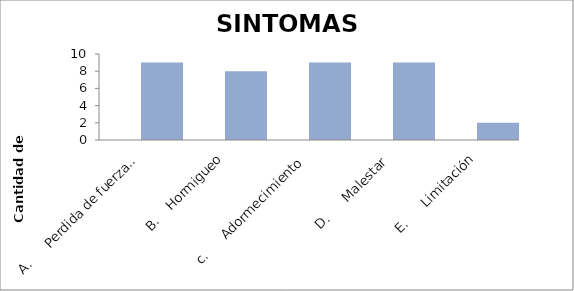
| Category | Series 0 | Series 1 |
|---|---|---|
| A.      Perdida de fuerza           |  | 9 |
| B.    Hormigueo |  | 8 |
| c.      Adormecimiento |  | 9 |
| D.      Malestar |  | 9 |
| E.      Limitación |  | 2 |